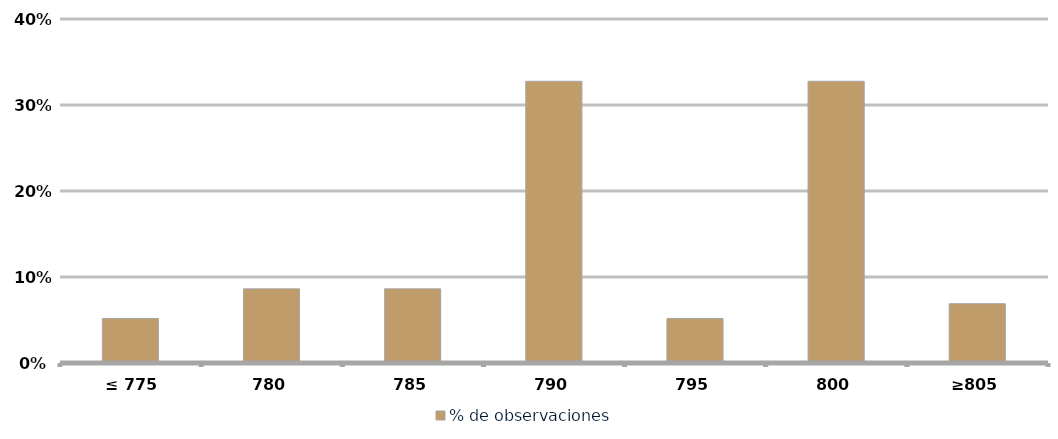
| Category | % de observaciones  |
|---|---|
|  ≤ 775  | 0.052 |
|  780  | 0.086 |
|  785  | 0.086 |
|  790  | 0.328 |
|  795  | 0.052 |
| 800 | 0.328 |
|  ≥805  | 0.069 |